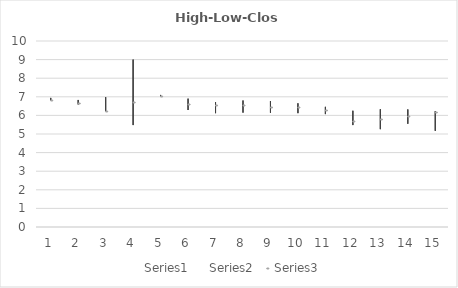
| Category | Series 0 | Series 1 | Series 2 |
|---|---|---|---|
| 0 | 6.94 | 6.81 | 6.82 |
| 1 | 6.83 | 6.59 | 6.68 |
| 2 | 6.98 | 6.23 | 6.26 |
| 3 | 9 | 5.48 | 6.71 |
| 4 | 7.1 | 7.01 | 7.04 |
| 5 | 6.9 | 6.29 | 6.62 |
| 6 | 6.71 | 6.12 | 6.55 |
| 7 | 6.8 | 6.15 | 6.58 |
| 8 | 6.77 | 6.14 | 6.47 |
| 9 | 6.65 | 6.12 | 6.45 |
| 10 | 6.46 | 6.07 | 6.31 |
| 11 | 6.25 | 5.48 | 5.71 |
| 12 | 6.33 | 5.26 | 5.79 |
| 13 | 6.32 | 5.55 | 5.98 |
| 14 | 6.23 | 5.17 | 6.2 |